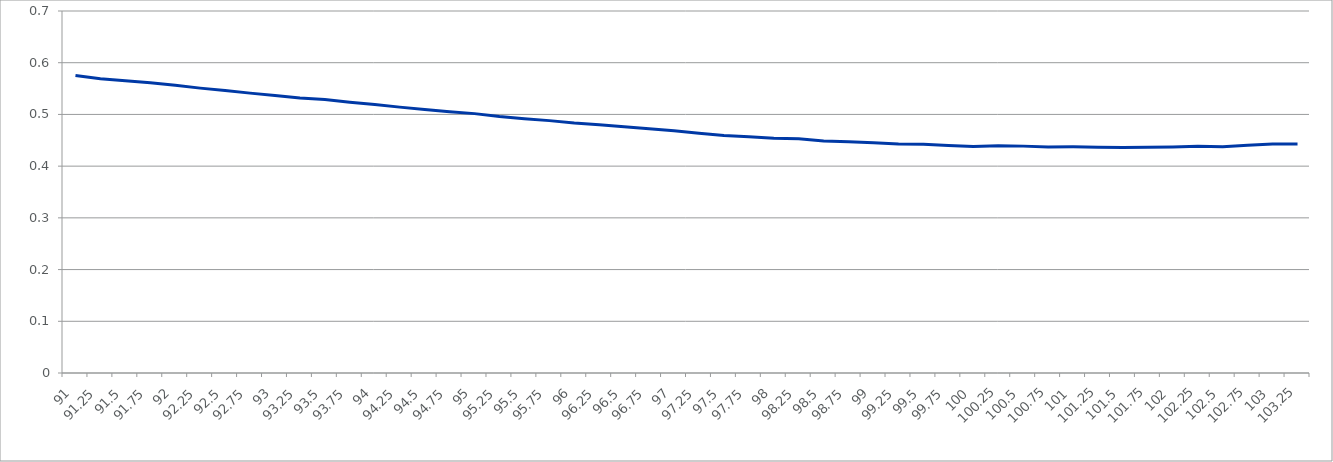
| Category | Series 0 |
|---|---|
| 91.0 | 0.575 |
| 91.25 | 0.569 |
| 91.5 | 0.565 |
| 91.75 | 0.561 |
| 92.0 | 0.556 |
| 92.25 | 0.551 |
| 92.5 | 0.546 |
| 92.75 | 0.541 |
| 93.0 | 0.537 |
| 93.25 | 0.532 |
| 93.5 | 0.529 |
| 93.75 | 0.524 |
| 94.0 | 0.519 |
| 94.25 | 0.514 |
| 94.5 | 0.51 |
| 94.75 | 0.505 |
| 95.0 | 0.502 |
| 95.25 | 0.496 |
| 95.5 | 0.492 |
| 95.75 | 0.488 |
| 96.0 | 0.483 |
| 96.25 | 0.48 |
| 96.5 | 0.476 |
| 96.75 | 0.472 |
| 97.0 | 0.468 |
| 97.25 | 0.464 |
| 97.5 | 0.459 |
| 97.75 | 0.457 |
| 98.0 | 0.454 |
| 98.25 | 0.453 |
| 98.5 | 0.449 |
| 98.75 | 0.447 |
| 99.0 | 0.445 |
| 99.25 | 0.443 |
| 99.5 | 0.442 |
| 99.75 | 0.44 |
| 100.0 | 0.438 |
| 100.25 | 0.439 |
| 100.5 | 0.439 |
| 100.75 | 0.437 |
| 101.0 | 0.437 |
| 101.25 | 0.437 |
| 101.5 | 0.436 |
| 101.75 | 0.436 |
| 102.0 | 0.437 |
| 102.25 | 0.438 |
| 102.5 | 0.437 |
| 102.75 | 0.44 |
| 103.0 | 0.443 |
| 103.25 | 0.443 |